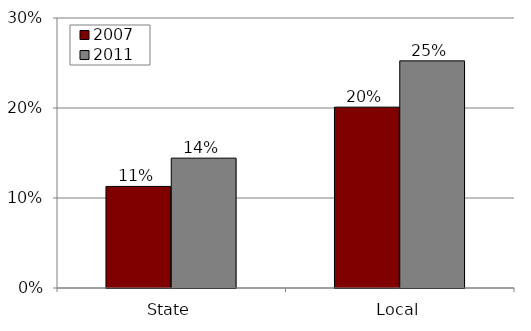
| Category | 2007 | 2011 |
|---|---|---|
| State | 0.113 | 0.144 |
| Local | 0.201 | 0.252 |